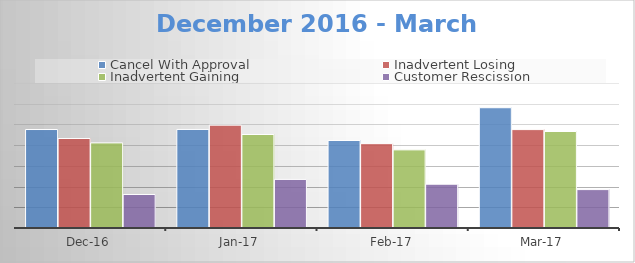
| Category | Cancel With Approval | Inadvertent Losing | Inadvertent Gaining | Customer Rescission |
|---|---|---|---|---|
| 2016-12-01 | 2377 | 2161 | 2054 | 809 |
| 2017-01-01 | 2379 | 2483 | 2257 | 1173 |
| 2017-02-01 | 2112 | 2036 | 1886 | 1057 |
| 2017-03-01 | 2903 | 2375 | 2329 | 927 |